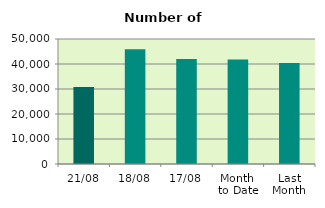
| Category | Series 0 |
|---|---|
| 21/08 | 30820 |
| 18/08 | 45864 |
| 17/08 | 41978 |
| Month 
to Date | 41837.867 |
| Last
Month | 40410.857 |